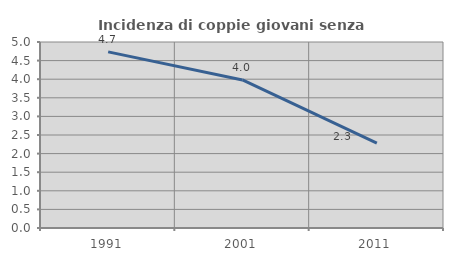
| Category | Incidenza di coppie giovani senza figli |
|---|---|
| 1991.0 | 4.734 |
| 2001.0 | 3.98 |
| 2011.0 | 2.279 |